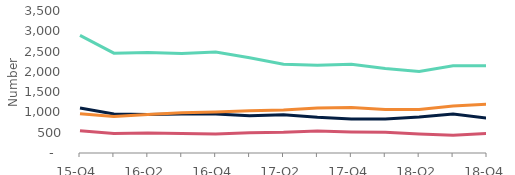
| Category | Arrears of 2.5%-5% of balance | Arrears of 5%-7.5% of balance | Arrears of 7.5%-10% of balance | Arrears over 10% of balance |
|---|---|---|---|---|
| 15-Q4 | 2900 | 1110 | 550 | 970 |
| 16-Q1 | 2460 | 960 | 480 | 900 |
| 16-Q2 | 2480 | 950 | 490 | 950 |
| 16-Q3 | 2450 | 960 | 480 | 990 |
| 16-Q4 | 2490 | 960 | 470 | 1010 |
| 17-Q1 | 2350 | 920 | 500 | 1040 |
| 17-Q2 | 2190 | 940 | 510 | 1060 |
| 17-Q3 | 2160 | 880 | 540 | 1110 |
| 17-Q4 | 2190 | 840 | 520 | 1120 |
| 18-Q1 | 2080 | 840 | 510 | 1070 |
| 18-Q2 | 2010 | 890 | 470 | 1070 |
| 18-Q3 | 2150 | 960 | 440 | 1160 |
| 18-Q4 | 2150 | 860 | 480 | 1200 |